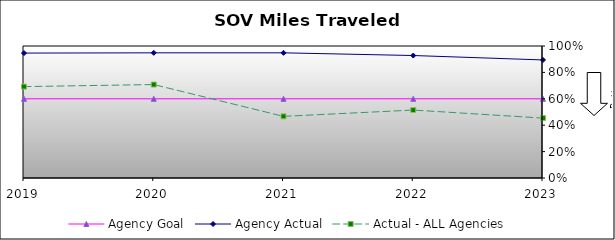
| Category | Agency Goal | Agency Actual | Actual - ALL Agencies |
|---|---|---|---|
| 2019.0 | 0.6 | 0.946 | 0.692 |
| 2020.0 | 0.6 | 0.948 | 0.708 |
| 2021.0 | 0.6 | 0.948 | 0.467 |
| 2022.0 | 0.6 | 0.928 | 0.515 |
| 2023.0 | 0.6 | 0.894 | 0.454 |